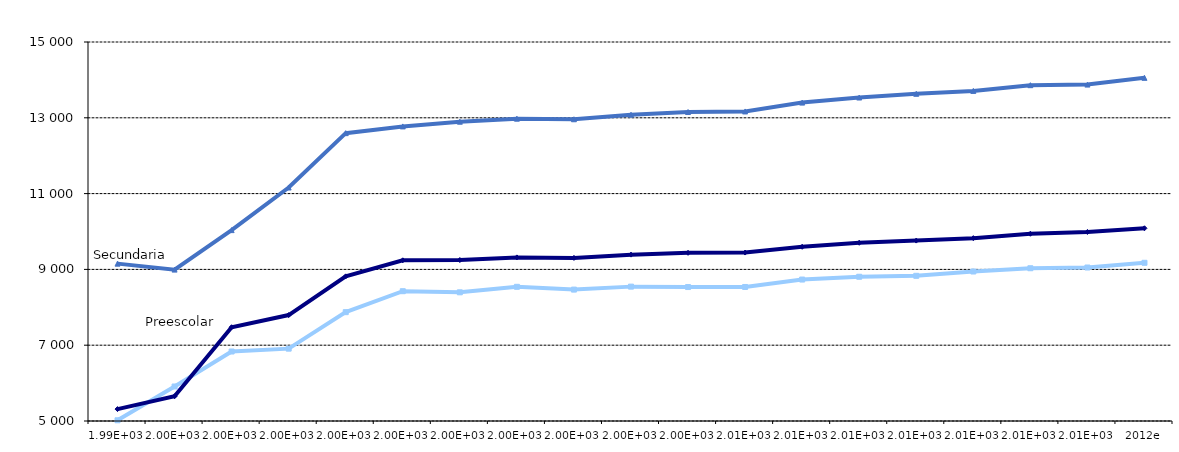
| Category | Primaria | Secundaria | Preescolar |
|---|---|---|---|
| 1994 | 5018.939 | 9152.182 | 5314.17 |
| 1995 | 5910.407 | 8994.097 | 5653.432 |
| 1996 | 6833.426 | 10036.594 | 7474.059 |
| 1997 | 6909.199 | 11161.014 | 7794.994 |
| 1998 | 7871.782 | 12594.851 | 8816.396 |
| 1999 | 8424.638 | 12772.838 | 9239.926 |
| 2000 | 8395.297 | 12897.123 | 9246.994 |
| 2001 | 8540.369 | 12976.924 | 9316.766 |
| 2002 | 8466.842 | 12961.585 | 9303.073 |
| 2003 | 8545.5 | 13082 | 9389.5 |
| 2004 | 8534.142 | 13152.619 | 9437.757 |
| 2005 | 8536.342 | 13167.762 | 9444.464 |
| 2006 | 8732.138 | 13400.807 | 9596.707 |
| 2007 | 8805.863 | 13534.938 | 9702.757 |
| 2008 | 8830.634 | 13633.259 | 9760.174 |
| 2009 | 8944.273 | 13709.664 | 9824.037 |
| 2010 | 9030.481 | 13860.739 | 9940.53 |
| 2011 | 9049.835 | 13876.413 | 9988.336 |
| 2012e | 9174.361 | 14054.341 | 10085.291 |